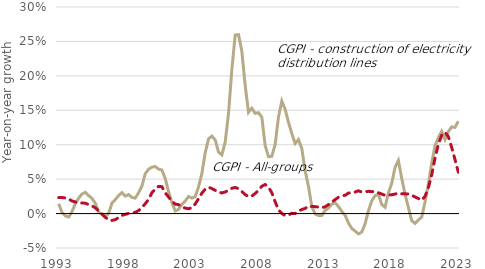
| Category | CGPI - construction of electricity distribution lines | CGPI - all groups |
|---|---|---|
| 1993 | 0.014 | 0.023 |
| 1994 | 0.002 | 0.023 |
| 1994 | -0.003 | 0.023 |
| 1994 | -0.005 | 0.021 |
| 1994 | 0.003 | 0.018 |
| 1995 | 0.014 | 0.017 |
| 1995 | 0.022 | 0.015 |
| 1995 | 0.028 | 0.015 |
| 1995 | 0.031 | 0.015 |
| 1996 | 0.026 | 0.013 |
| 1996 | 0.022 | 0.011 |
| 1996 | 0.015 | 0.008 |
| 1996 | 0.002 | 0.004 |
| 1997 | -0.002 | 0 |
| 1997 | -0.004 | -0.006 |
| 1997 | 0 | -0.009 |
| 1997 | 0.015 | -0.01 |
| 1998 | 0.02 | -0.009 |
| 1998 | 0.026 | -0.006 |
| 1998 | 0.03 | -0.003 |
| 1998 | 0.025 | -0.001 |
| 1999 | 0.028 | 0 |
| 1999 | 0.023 | 0.001 |
| 1999 | 0.022 | 0.002 |
| 1999 | 0.03 | 0.004 |
| 2000 | 0.04 | 0.009 |
| 2000 | 0.058 | 0.014 |
| 2000 | 0.064 | 0.021 |
| 2000 | 0.067 | 0.03 |
| 2001 | 0.068 | 0.036 |
| 2001 | 0.065 | 0.039 |
| 2001 | 0.063 | 0.039 |
| 2001 | 0.051 | 0.03 |
| 2002 | 0.032 | 0.024 |
| 2002 | 0.016 | 0.018 |
| 2002 | 0.004 | 0.014 |
| 2002 | 0.006 | 0.013 |
| 2003 | 0.013 | 0.01 |
| 2003 | 0.018 | 0.008 |
| 2003 | 0.025 | 0.007 |
| 2003 | 0.022 | 0.009 |
| 2004 | 0.024 | 0.014 |
| 2004 | 0.039 | 0.022 |
| 2004 | 0.058 | 0.03 |
| 2004 | 0.088 | 0.036 |
| 2005 | 0.109 | 0.038 |
| 2005 | 0.112 | 0.036 |
| 2005 | 0.107 | 0.034 |
| 2005 | 0.089 | 0.031 |
| 2006 | 0.085 | 0.03 |
| 2006 | 0.104 | 0.031 |
| 2006 | 0.145 | 0.034 |
| 2006 | 0.209 | 0.037 |
| 2007 | 0.259 | 0.038 |
| 2007 | 0.26 | 0.036 |
| 2007 | 0.236 | 0.032 |
| 2007 | 0.186 | 0.028 |
| 2008 | 0.147 | 0.025 |
| 2008 | 0.153 | 0.025 |
| 2008 | 0.146 | 0.029 |
| 2008 | 0.146 | 0.034 |
| 2009 | 0.14 | 0.04 |
| 2009 | 0.099 | 0.042 |
| 2009 | 0.083 | 0.038 |
| 2009 | 0.083 | 0.03 |
| 2010 | 0.1 | 0.017 |
| 2010 | 0.14 | 0.005 |
| 2010 | 0.163 | 0 |
| 2010 | 0.152 | -0.003 |
| 2011 | 0.133 | -0.002 |
| 2011 | 0.116 | 0 |
| 2011 | 0.102 | 0 |
| 2011 | 0.107 | 0.003 |
| 2012 | 0.094 | 0.006 |
| 2012 | 0.062 | 0.007 |
| 2012 | 0.04 | 0.011 |
| 2012 | 0.01 | 0.01 |
| 2013 | -0.001 | 0.01 |
| 2013 | -0.003 | 0.009 |
| 2013 | -0.003 | 0.008 |
| 2013 | 0.005 | 0.01 |
| 2014 | 0.008 | 0.013 |
| 2014 | 0.014 | 0.017 |
| 2014 | 0.016 | 0.02 |
| 2014 | 0.01 | 0.024 |
| 2015 | 0.003 | 0.025 |
| 2015 | -0.002 | 0.027 |
| 2015 | -0.014 | 0.03 |
| 2015 | -0.022 | 0.031 |
| 2016 | -0.025 | 0.031 |
| 2016 | -0.029 | 0.033 |
| 2016 | -0.027 | 0.031 |
| 2016 | -0.015 | 0.032 |
| 2017 | 0.004 | 0.032 |
| 2017 | 0.018 | 0.032 |
| 2017 | 0.026 | 0.032 |
| 2017 | 0.028 | 0.03 |
| 2018 | 0.013 | 0.028 |
| 2018 | 0.009 | 0.026 |
| 2018 | 0.03 | 0.027 |
| 2018 | 0.044 | 0.027 |
| 2019 | 0.067 | 0.028 |
| 2019 | 0.077 | 0.03 |
| 2019 | 0.051 | 0.029 |
| 2019 | 0.028 | 0.029 |
| 2020 | 0.009 | 0.028 |
| 2020 | -0.01 | 0.026 |
| 2020 | -0.014 | 0.024 |
| 2020 | -0.009 | 0.022 |
| 2021 | -0.005 | 0.019 |
| 2021 | 0.017 | 0.025 |
| 2021 | 0.042 | 0.038 |
| 2021 | 0.073 | 0.056 |
| 2022 | 0.098 | 0.081 |
| 2022 | 0.11 | 0.101 |
| 2022 | 0.12 | 0.114 |
| 2022 | 0.107 | 0.118 |
| 2023 | 0.119 | 0.112 |
| 2023 | 0.126 | 0.096 |
| 2023 | 0.125 | 0.078 |
| 2023 | 0.134 | 0.06 |